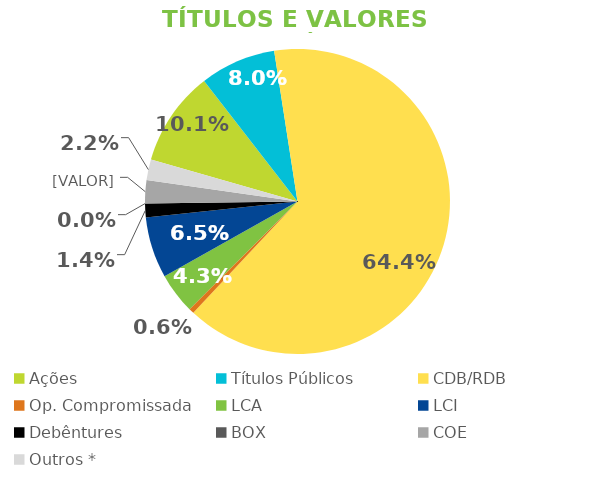
| Category | TVM |
|---|---|
| Ações | 0.101 |
| Títulos Públicos | 0.08 |
| CDB/RDB | 0.644 |
| Op. Compromissada | 0.006 |
| LCA | 0.043 |
| LCI | 0.065 |
| Debêntures | 0.014 |
| BOX | 0 |
| COE | 0.025 |
| Outros * | 0.022 |